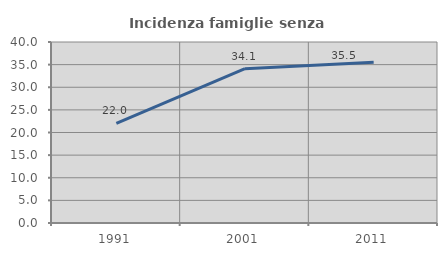
| Category | Incidenza famiglie senza nuclei |
|---|---|
| 1991.0 | 22.023 |
| 2001.0 | 34.102 |
| 2011.0 | 35.521 |